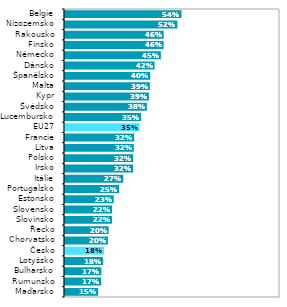
| Category | Series 0 |
|---|---|
| Maďarsko | 0.154 |
| Rumunsko | 0.168 |
| Bulharsko | 0.169 |
| Lotyšsko | 0.176 |
| Česko | 0.181 |
| Chorvatsko | 0.2 |
| Řecko | 0.203 |
| Slovinsko | 0.218 |
| Slovensko | 0.219 |
| Estonsko | 0.227 |
| Portugalsko | 0.252 |
| Itálie | 0.271 |
| Irsko | 0.317 |
| Polsko | 0.317 |
| Litva | 0.32 |
| Francie | 0.322 |
| EU27 | 0.347 |
| Lucembursko | 0.353 |
| Švédsko | 0.381 |
| Kypr | 0.39 |
| Malta | 0.394 |
| Španělsko | 0.396 |
| Dánsko | 0.417 |
| Německo | 0.446 |
| Finsko | 0.459 |
| Rakousko | 0.459 |
| Nizozemsko | 0.523 |
| Belgie | 0.542 |